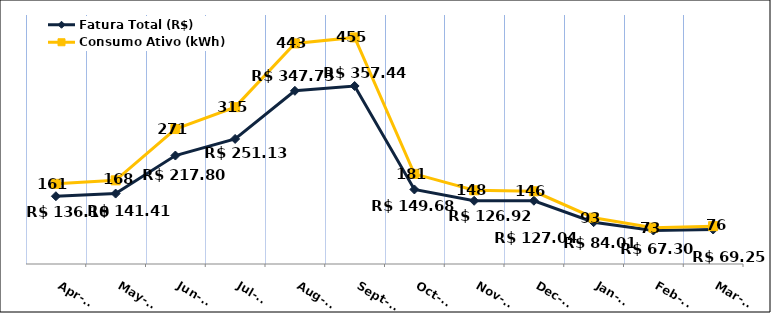
| Category | Fatura Total (R$) |
|---|---|
| 2023-04-01 | 136.1 |
| 2023-05-01 | 141.41 |
| 2023-06-01 | 217.8 |
| 2023-07-01 | 251.13 |
| 2023-08-01 | 347.73 |
| 2023-09-01 | 357.44 |
| 2023-10-01 | 149.68 |
| 2023-11-01 | 126.92 |
| 2023-12-01 | 127.04 |
| 2024-01-01 | 84.01 |
| 2024-02-01 | 67.3 |
| 2024-03-01 | 69.25 |